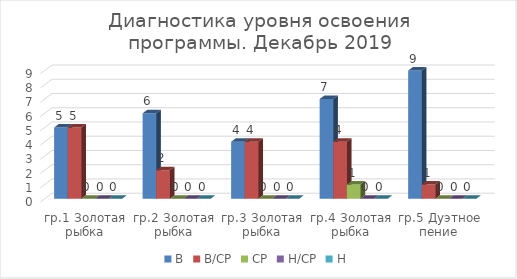
| Category | В | В/СР | СР | Н/СР | Н |
|---|---|---|---|---|---|
| гр.1 Золотая рыбка | 5 | 5 | 0 | 0 | 0 |
| гр.2 Золотая рыбка | 6 | 2 | 0 | 0 | 0 |
| гр.3 Золотая рыбка | 4 | 4 | 0 | 0 | 0 |
| гр.4 Золотая рыбка | 7 | 4 | 1 | 0 | 0 |
| гр.5 Дуэтное пение | 9 | 1 | 0 | 0 | 0 |